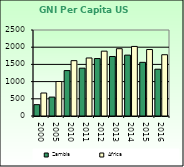
| Category | Zambia | Africa                        |
|---|---|---|
| 2000.0 | 330 | 668.557 |
| 2005.0 | 550 | 1002.896 |
| 2010.0 | 1320 | 1608.999 |
| 2011.0 | 1390 | 1686.521 |
| 2012.0 | 1670 | 1885.129 |
| 2013.0 | 1730 | 1956.671 |
| 2014.0 | 1770 | 2022.289 |
| 2015.0 | 1560 | 1932.283 |
| 2016.0 | 1360 | 1781.415 |